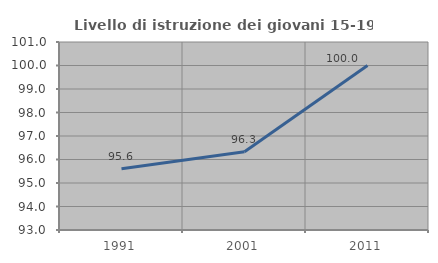
| Category | Livello di istruzione dei giovani 15-19 anni |
|---|---|
| 1991.0 | 95.604 |
| 2001.0 | 96.33 |
| 2011.0 | 100 |